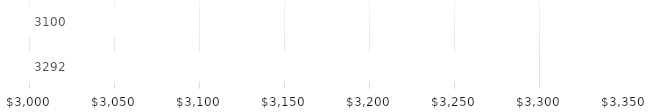
| Category | MONTH TOTALS |
|---|---|
| INCOME | 3292 |
| EXPENDITURES | 3100 |